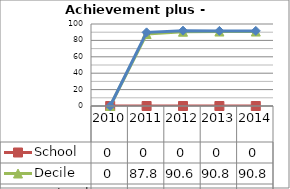
| Category | School  | Decile | National |
|---|---|---|---|
| 2010.0 | 0 | 0 | 0 |
| 2011.0 | 0 | 87.8 | 89.8 |
| 2012.0 | 0 | 90.6 | 91.9 |
| 2013.0 | 0 | 90.8 | 91.6 |
| 2014.0 | 0 | 90.8 | 91.6 |